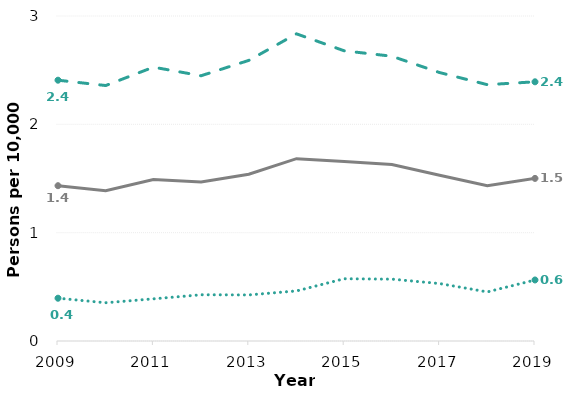
| Category | Persons | Females | Males |
|---|---|---|---|
| 2009.0 | 1.434 | 2.407 | 0.395 |
| 2010.0 | 1.387 | 2.358 | 0.353 |
| 2011.0 | 1.491 | 2.528 | 0.389 |
| 2012.0 | 1.468 | 2.449 | 0.427 |
| 2013.0 | 1.539 | 2.59 | 0.425 |
| 2014.0 | 1.683 | 2.835 | 0.462 |
| 2015.0 | 1.656 | 2.679 | 0.575 |
| 2016.0 | 1.628 | 2.629 | 0.571 |
| 2017.0 | 1.53 | 2.478 | 0.53 |
| 2018.0 | 1.434 | 2.366 | 0.453 |
| 2019.0 | 1.501 | 2.393 | 0.563 |